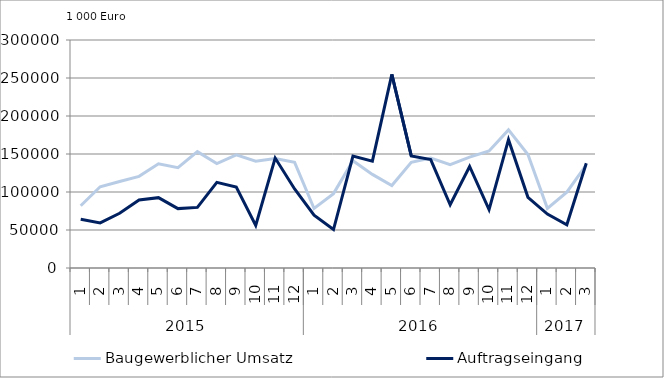
| Category | Baugewerblicher Umsatz | Auftragseingang |
|---|---|---|
| 0 | 81937.361 | 64244.383 |
| 1 | 106908.454 | 59377.677 |
| 2 | 113904.285 | 71953.971 |
| 3 | 120612.446 | 89496.024 |
| 4 | 137142.75 | 92563.213 |
| 5 | 132019.811 | 78131.737 |
| 6 | 153125.961 | 79765.729 |
| 7 | 137370.133 | 112637.987 |
| 8 | 148792.629 | 106572.56 |
| 9 | 140483.911 | 56073.767 |
| 10 | 144146.162 | 144643.688 |
| 11 | 139085.889 | 103931.175 |
| 12 | 78291.738 | 69470.357 |
| 13 | 97863.379 | 50640.033 |
| 14 | 141176.119 | 147206.65 |
| 15 | 123121.297 | 140579.009 |
| 16 | 108561.124 | 254739.334 |
| 17 | 139030.209 | 147481.644 |
| 18 | 144784.416 | 142609.658 |
| 19 | 135870.195 | 83192.156 |
| 20 | 145961.738 | 133594.351 |
| 21 | 153886.826 | 76793.838 |
| 22 | 181740.037 | 168867.568 |
| 23 | 149348.138 | 93011.853 |
| 24 | 78446.78 | 70908.903 |
| 25 | 99841.908 | 56868.408 |
| 26 | 135679.867 | 137790.423 |